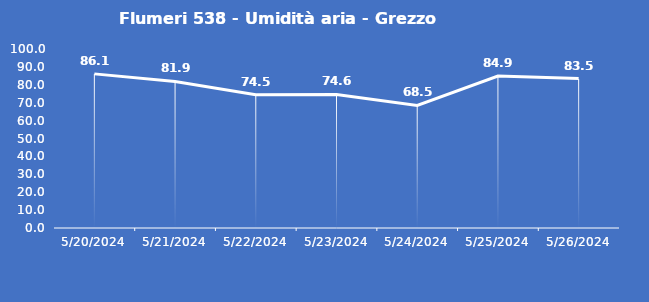
| Category | Flumeri 538 - Umidità aria - Grezzo (%) |
|---|---|
| 5/20/24 | 86.1 |
| 5/21/24 | 81.9 |
| 5/22/24 | 74.5 |
| 5/23/24 | 74.6 |
| 5/24/24 | 68.5 |
| 5/25/24 | 84.9 |
| 5/26/24 | 83.5 |